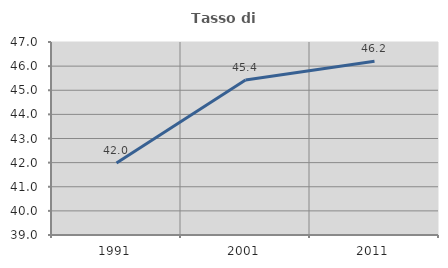
| Category | Tasso di occupazione   |
|---|---|
| 1991.0 | 41.984 |
| 2001.0 | 45.425 |
| 2011.0 | 46.198 |